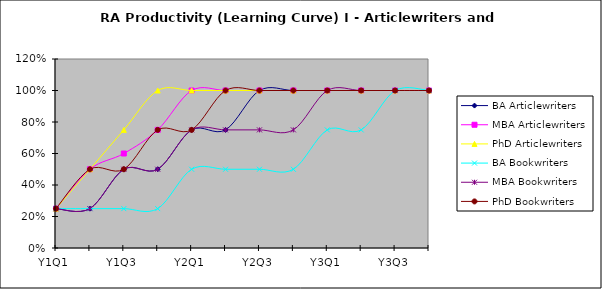
| Category | BA Articlewriters | MBA Articlewriters | PhD Articlewriters | BA Bookwriters | MBA Bookwriters  | PhD Bookwriters  |
|---|---|---|---|---|---|---|
| Y1Q1 | 0.25 | 0.25 | 0.25 | 0.25 | 0.25 | 0.25 |
| Y1Q2 | 0.25 | 0.5 | 0.5 | 0.25 | 0.25 | 0.5 |
| Y1Q3 | 0.5 | 0.6 | 0.75 | 0.25 | 0.5 | 0.5 |
| Y1Q4 | 0.5 | 0.75 | 1 | 0.25 | 0.5 | 0.75 |
| Y2Q1 | 0.75 | 1 | 1 | 0.5 | 0.75 | 0.75 |
| Y2Q2 | 0.75 | 1 | 1 | 0.5 | 0.75 | 1 |
| Y2Q3 | 1 | 1 | 1 | 0.5 | 0.75 | 1 |
| Y2Q4 | 1 | 1 | 1 | 0.5 | 0.75 | 1 |
| Y3Q1 | 1 | 1 | 1 | 0.75 | 1 | 1 |
| Y3Q2 | 1 | 1 | 1 | 0.75 | 1 | 1 |
| Y3Q3 | 1 | 1 | 1 | 1 | 1 | 1 |
| Y3Q4 | 1 | 1 | 1 | 1 | 1 | 1 |